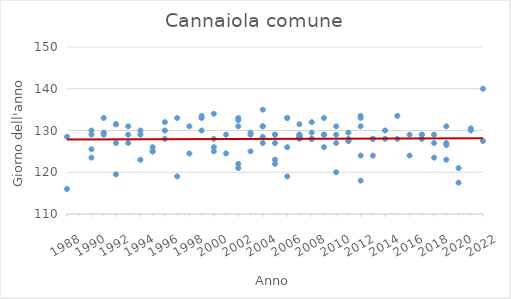
| Category | Series 0 |
|---|---|
| 1988.0 | 116 |
| 1988.0 | 128.5 |
| 1990.0 | 129 |
| 1990.0 | 125.5 |
| 1990.0 | 123.5 |
| 1990.0 | 130 |
| 1991.0 | 129 |
| 1991.0 | 129.5 |
| 1991.0 | 133 |
| 1992.0 | 127 |
| 1992.0 | 119.5 |
| 1992.0 | 131.5 |
| 1992.0 | 131.5 |
| 1993.0 | 131 |
| 1993.0 | 127 |
| 1993.0 | 129 |
| 1994.0 | 130 |
| 1994.0 | 129 |
| 1994.0 | 123 |
| 1995.0 | 125 |
| 1995.0 | 125 |
| 1995.0 | 126 |
| 1996.0 | 132 |
| 1996.0 | 128 |
| 1996.0 | 130 |
| 1997.0 | 119 |
| 1997.0 | 133 |
| 1998.0 | 124.5 |
| 1998.0 | 131 |
| 1999.0 | 133 |
| 1999.0 | 130 |
| 1999.0 | 133.5 |
| 2000.0 | 126 |
| 2000.0 | 125 |
| 2000.0 | 128 |
| 2000.0 | 134 |
| 2001.0 | 129 |
| 2001.0 | 124.5 |
| 2002.0 | 133 |
| 2002.0 | 131 |
| 2002.0 | 132.5 |
| 2002.0 | 121 |
| 2002.0 | 122 |
| 2003.0 | 129 |
| 2003.0 | 129.5 |
| 2003.0 | 125 |
| 2004.0 | 128.5 |
| 2004.0 | 135 |
| 2004.0 | 131 |
| 2004.0 | 131 |
| 2004.0 | 127 |
| 2005.0 | 129 |
| 2005.0 | 129 |
| 2005.0 | 127 |
| 2005.0 | 123 |
| 2005.0 | 122 |
| 2006.0 | 119 |
| 2006.0 | 133 |
| 2006.0 | 126 |
| 2006.0 | 133 |
| 2007.0 | 129 |
| 2007.0 | 128.5 |
| 2007.0 | 131.5 |
| 2007.0 | 129 |
| 2007.0 | 128.5 |
| 2007.0 | 128 |
| 2007.0 | 128.5 |
| 2008.0 | 128 |
| 2008.0 | 128 |
| 2008.0 | 132 |
| 2008.0 | 128 |
| 2008.0 | 129.5 |
| 2009.0 | 129 |
| 2009.0 | 129 |
| 2009.0 | 126 |
| 2009.0 | 133 |
| 2010.0 | 131 |
| 2010.0 | 127 |
| 2010.0 | 120 |
| 2010.0 | 129 |
| 2011.0 | 127.5 |
| 2011.0 | 127.5 |
| 2011.0 | 128 |
| 2011.0 | 129.5 |
| 2012.0 | 133 |
| 2012.0 | 131 |
| 2012.0 | 133.5 |
| 2012.0 | 118 |
| 2012.0 | 124 |
| 2013.0 | 128 |
| 2013.0 | 128 |
| 2013.0 | 124 |
| 2014.0 | 130 |
| 2014.0 | 128 |
| 2015.0 | 128 |
| 2015.0 | 133.5 |
| 2016.0 | 129 |
| 2016.0 | 124 |
| 2017.0 | 129 |
| 2017.0 | 129 |
| 2017.0 | 128 |
| 2018.0 | 129 |
| 2018.0 | 127 |
| 2018.0 | 123.5 |
| 2019.0 | 131 |
| 2019.0 | 127 |
| 2019.0 | 126.5 |
| 2019.0 | 123 |
| 2020.0 | 121 |
| 2020.0 | 117.5 |
| 2021.0 | 130.5 |
| 2021.0 | 130 |
| 2022.0 | 127.5 |
| 2022.0 | 140 |